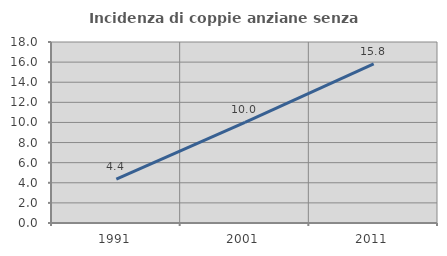
| Category | Incidenza di coppie anziane senza figli  |
|---|---|
| 1991.0 | 4.354 |
| 2001.0 | 10.011 |
| 2011.0 | 15.817 |